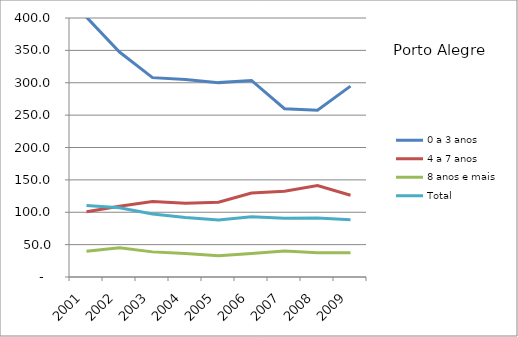
| Category | 0 a 3 anos | 4 a 7 anos | 8 anos e mais | Total |
|---|---|---|---|---|
| 2001.0 | 401.3 | 100.8 | 39.6 | 110.4 |
| 2002.0 | 347.4 | 109.3 | 45 | 107 |
| 2003.0 | 307.9 | 116.6 | 38.8 | 97.2 |
| 2004.0 | 304.9 | 114 | 36.2 | 91.9 |
| 2005.0 | 300.2 | 115.4 | 32.8 | 88 |
| 2006.0 | 303.6 | 129.8 | 36.4 | 92.9 |
| 2007.0 | 259.9 | 132.6 | 40 | 90.9 |
| 2008.0 | 257.6 | 141.2 | 37.4 | 91.2 |
| 2009.0 | 294.8 | 126.3 | 37.4 | 88.3 |